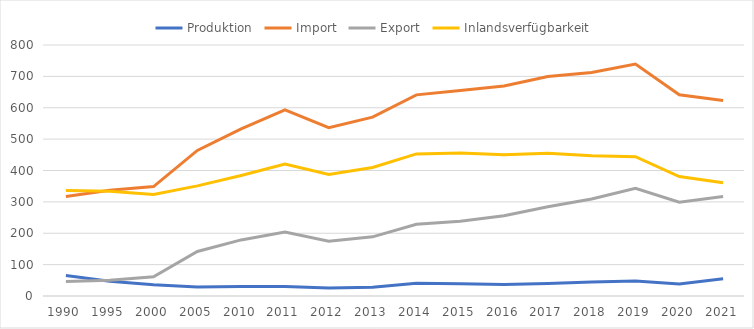
| Category | Produktion | Import | Export | Inlandsverfügbarkeit |
|---|---|---|---|---|
| 1990.0 | 65 | 317.1 | 46.1 | 336 |
| 1995.0 | 47 | 337.1 | 50.5 | 333.6 |
| 2000.0 | 36 | 348.8 | 61.1 | 323.7 |
| 2005.0 | 28.8 | 464 | 141.8 | 351 |
| 2010.0 | 30.2 | 532.7 | 178.8 | 384.1 |
| 2011.0 | 30.3 | 593.6 | 203.7 | 420.2 |
| 2012.0 | 25.5 | 536.7 | 174.8 | 387.4 |
| 2013.0 | 27.9 | 570.2 | 188.6 | 409.5 |
| 2014.0 | 40.5 | 641.1 | 228.8 | 452.8 |
| 2015.0 | 38.8 | 654.8 | 238.1 | 455.5 |
| 2016.0 | 36.7 | 669.2 | 255.9 | 450 |
| 2017.0 | 39.5 | 699.5 | 284.4 | 454.6 |
| 2018.0 | 44.5 | 712.2 | 309.3 | 447.4 |
| 2019.0 | 48.1 | 739.279 | 343.318 | 444.061 |
| 2020.0 | 38.263 | 641.422 | 299.144 | 380.541 |
| 2021.0 | 54.695 | 623.265 | 317.107 | 360.853 |